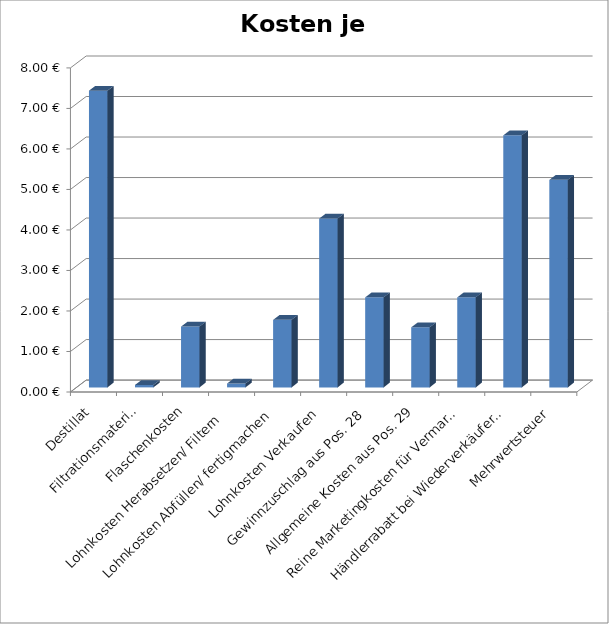
| Category | Kosten je Flasche |
|---|---|
| Destillat | 7.324 |
| Filtrationsmaterial | 0.06 |
| Flaschenkosten | 1.5 |
| Lohnkosten Herabsetzen/ Filtern  | 0.095 |
| Lohnkosten Abfüllen/ fertigmachen | 1.667 |
| Lohnkosten Verkaufen | 4.167 |
| Gewinnzuschlag aus Pos. 28 | 2.222 |
| Allgemeine Kosten aus Pos. 29 | 1.481 |
| Reine Marketingkosten für Vermarktung Pos.30 | 2.222 |
| Händlerrabatt bei Wiederverkäufer Pos 31 | 6.222 |
| Mehrwertsteuer | 5.122 |